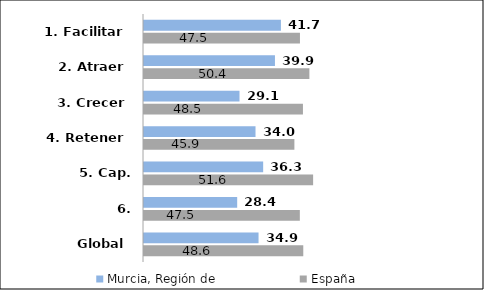
| Category | Murcia, Región de | España |
|---|---|---|
| 1. Facilitar | 41.74 | 47.545 |
| 2. Atraer | 39.925 | 50.424 |
| 3. Crecer | 29.12 | 48.458 |
| 4. Retener | 34.001 | 45.853 |
| 5. Cap. técnicas | 36.332 | 51.565 |
| 6. Conocimiento | 28.411 | 47.508 |
| Global | 34.921 | 48.559 |